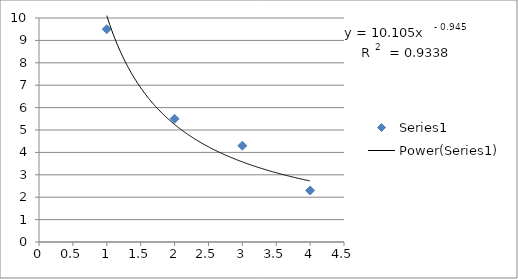
| Category | Series 0 |
|---|---|
| 1.0 | 9.5 |
| 2.0 | 5.5 |
| 3.0 | 4.3 |
| 4.0 | 2.3 |